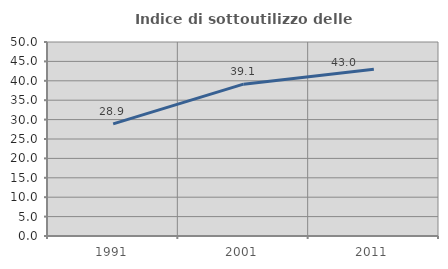
| Category | Indice di sottoutilizzo delle abitazioni  |
|---|---|
| 1991.0 | 28.909 |
| 2001.0 | 39.13 |
| 2011.0 | 42.978 |